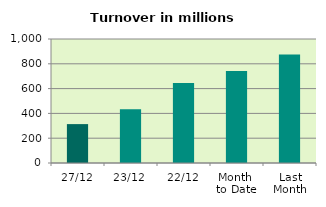
| Category | Series 0 |
|---|---|
| 27/12 | 313.672 |
| 23/12 | 434.115 |
| 22/12 | 644.85 |
| Month 
to Date | 741.429 |
| Last
Month | 874.327 |